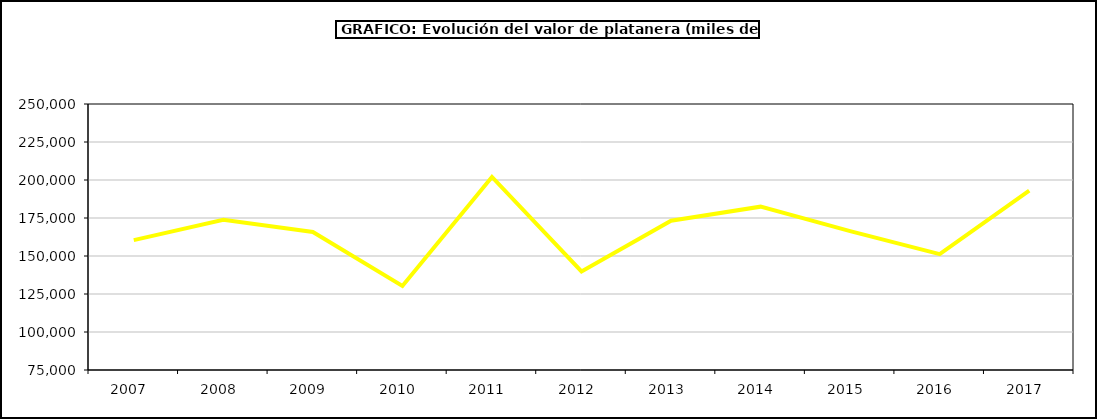
| Category | valor platanera |
|---|---|
| 2007.0 | 160436.416 |
| 2008.0 | 173883.195 |
| 2009.0 | 165826.349 |
| 2010.0 | 130319.145 |
| 2011.0 | 202014.747 |
| 2012.0 | 139816.382 |
| 2013.0 | 173165.464 |
| 2014.0 | 182466.749 |
| 2015.0 | 166392 |
| 2016.0 | 151266 |
| 2017.0 | 192961.354 |